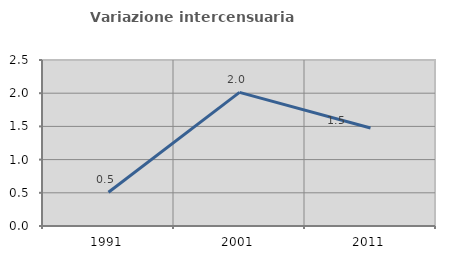
| Category | Variazione intercensuaria annua |
|---|---|
| 1991.0 | 0.508 |
| 2001.0 | 2.013 |
| 2011.0 | 1.477 |